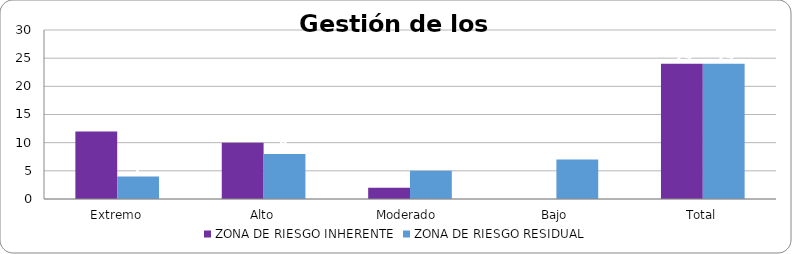
| Category | ZONA DE RIESGO INHERENTE | ZONA DE RIESGO RESIDUAL |
|---|---|---|
| Extremo | 12 | 4 |
| Alto | 10 | 8 |
| Moderado  | 2 | 5 |
| Bajo | 0 | 7 |
| Total | 24 | 24 |